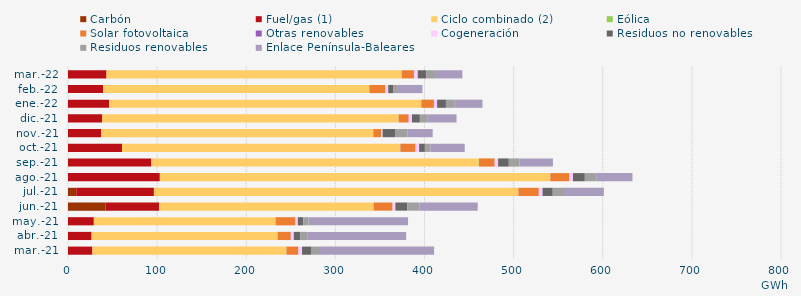
| Category | Carbón | Fuel/gas (1) | Ciclo combinado (2) | Eólica | Solar fotovoltaica | Otras renovables | Cogeneración | Residuos no renovables | Residuos renovables | Enlace Península-Baleares |
|---|---|---|---|---|---|---|---|---|---|---|
| mar.-21 | -0.652 | 27.374 | 217.479 | 0.306 | 13.295 | 0.138 | 3.995 | 10.093 | 10.093 | 127.986 |
| abr.-21 | -0.591 | 26.435 | 208.531 | 0.295 | 14.715 | 0.106 | 3.221 | 7.539 | 7.539 | 111.022 |
| may.-21 | -1.103 | 28.997 | 203.813 | 0.19 | 22.208 | 0.119 | 2.572 | 6.024 | 6.024 | 111.602 |
| jun.-21 | 41.953 | 60.343 | 240.581 | 0.094 | 21.17 | 0.1 | 3.062 | 13.482 | 13.482 | 65.429 |
| jul.-21 | 9.293 | 87.1 | 408.794 | 0.106 | 22.966 | 0.096 | 4.086 | 11.473 | 11.473 | 45.879 |
| ago.-21 | -0.729 | 103.041 | 437.914 | 0.201 | 21.415 | 0.084 | 3.931 | 13.32 | 13.32 | 40.107 |
| sep.-21 | -0.55 | 93.586 | 367.241 | 0.274 | 17.622 | 0.081 | 3.819 | 11.973 | 11.973 | 37.549 |
| oct.-21 | -0.583 | 60.568 | 312.103 | 0.27 | 16.793 | 0.243 | 4.021 | 6.415 | 6.415 | 38.286 |
| nov.-21 | -0.582 | 37.046 | 305.438 | 0.061 | 8.81 | 0.24 | 1.412 | 13.868 | 13.868 | 28.436 |
| dic.-21 | -0.614 | 38.331 | 332.591 | 0.101 | 11.149 | 0.23 | 3.519 | 8.866 | 8.866 | 32.271 |
| ene.-22 | -0.627 | 46.217 | 350.083 | 0.216 | 13.972 | 0.285 | 3.401 | 9.871 | 9.871 | 31.159 |
| feb.-22 | -0.58 | 39.3 | 298.618 | 0.228 | 17.801 | 0.281 | 3.068 | 5.441 | 5.441 | 27.503 |
| mar.-22 | -0.669 | 43.217 | 330.995 | 0.338 | 13.606 | 0.291 | 3.993 | 9.663 | 9.663 | 30.689 |